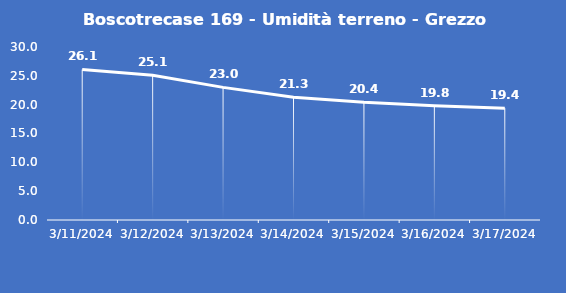
| Category | Boscotrecase 169 - Umidità terreno - Grezzo (%VWC) |
|---|---|
| 3/11/24 | 26.1 |
| 3/12/24 | 25.1 |
| 3/13/24 | 23 |
| 3/14/24 | 21.3 |
| 3/15/24 | 20.4 |
| 3/16/24 | 19.8 |
| 3/17/24 | 19.4 |